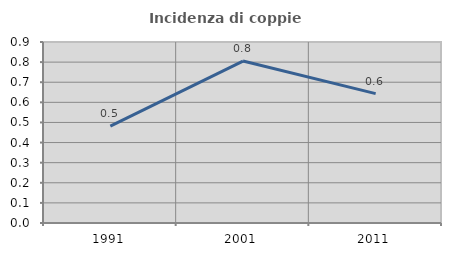
| Category | Incidenza di coppie miste |
|---|---|
| 1991.0 | 0.482 |
| 2001.0 | 0.805 |
| 2011.0 | 0.643 |